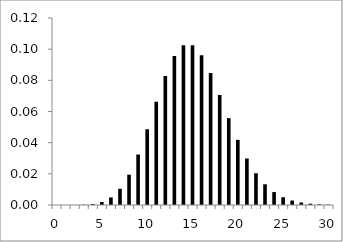
| Category | Series 0 |
|---|---|
| 0.0 | 0 |
| 1.0 | 0 |
| 2.0 | 0 |
| 3.0 | 0 |
| 4.0 | 0.001 |
| 5.0 | 0.002 |
| 6.0 | 0.005 |
| 7.0 | 0.01 |
| 8.0 | 0.019 |
| 9.0 | 0.032 |
| 10.0 | 0.049 |
| 11.0 | 0.066 |
| 12.0 | 0.083 |
| 13.0 | 0.096 |
| 14.0 | 0.102 |
| 15.0 | 0.102 |
| 16.0 | 0.096 |
| 17.0 | 0.085 |
| 18.0 | 0.071 |
| 19.0 | 0.056 |
| 20.0 | 0.042 |
| 21.0 | 0.03 |
| 22.0 | 0.02 |
| 23.0 | 0.013 |
| 24.0 | 0.008 |
| 25.0 | 0.005 |
| 26.0 | 0.003 |
| 27.0 | 0.002 |
| 28.0 | 0.001 |
| 29.0 | 0 |
| 30.0 | 0 |